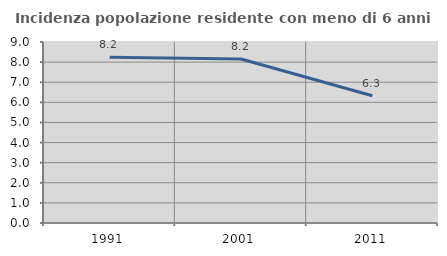
| Category | Incidenza popolazione residente con meno di 6 anni |
|---|---|
| 1991.0 | 8.241 |
| 2001.0 | 8.158 |
| 2011.0 | 6.328 |